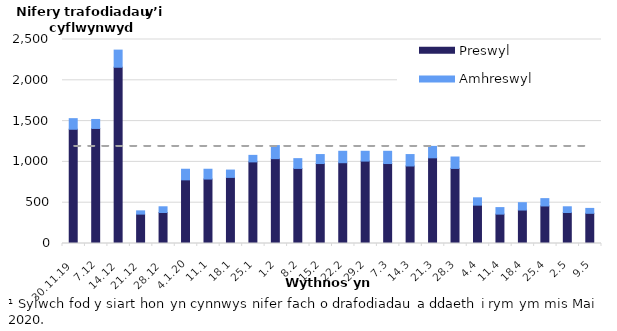
| Category | Preswyl | Amhreswyl |
|---|---|---|
| 2019-11-30 | 1400 | 130 |
| 2019-12-07 | 1410 | 110 |
| 2019-12-14 | 2160 | 210 |
| 2019-12-21 | 360 | 40 |
| 2019-12-28 | 380 | 70 |
| 2020-01-04 | 780 | 130 |
| 2020-01-11 | 790 | 120 |
| 2020-01-18 | 810 | 90 |
| 2020-01-25 | 1000 | 80 |
| 2020-02-01 | 1040 | 160 |
| 2020-02-08 | 920 | 120 |
| 2020-02-15 | 980 | 110 |
| 2020-02-22 | 990 | 140 |
| 2020-02-29 | 1010 | 120 |
| 2020-03-07 | 980 | 150 |
| 2020-03-14 | 950 | 140 |
| 2020-03-21 | 1050 | 140 |
| 2020-03-28 | 920 | 140 |
| 2020-04-04 | 470 | 90 |
| 2020-04-11 | 360 | 80 |
| 2020-04-18 | 410 | 90 |
| 2020-04-25 | 460 | 90 |
| 2020-05-02 | 380 | 70 |
| 2020-05-09 | 370 | 60 |